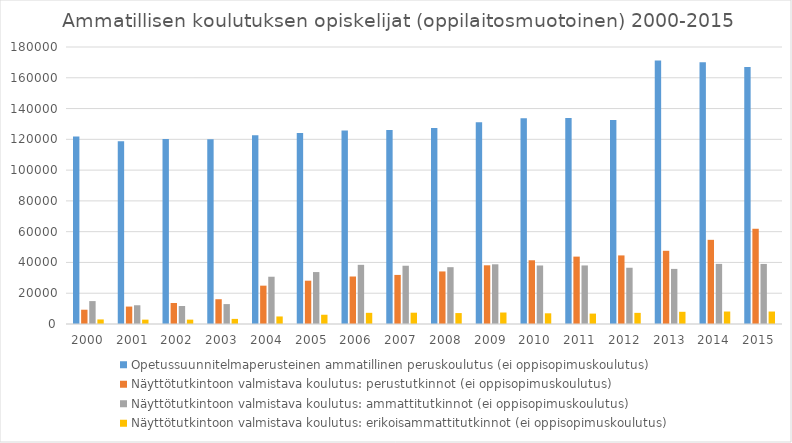
| Category | Opetussuunnitelmaperusteinen ammatillinen peruskoulutus (ei oppisopimuskoulutus) | Näyttötutkintoon valmistava koulutus: perustutkinnot (ei oppisopimuskoulutus) | Näyttötutkintoon valmistava koulutus: ammattitutkinnot (ei oppisopimuskoulutus) | Näyttötutkintoon valmistava koulutus: erikoisammattitutkinnot (ei oppisopimuskoulutus) |
|---|---|---|---|---|
| 2000 | 121812 | 9279 | 14888 | 2965 |
| 2001 | 118679 | 11325 | 12177 | 2838 |
| 2002 | 120217 | 13655 | 11687 | 2840 |
| 2003 | 120111 | 16098 | 12938 | 3313 |
| 2004 | 122607 | 24914 | 30716 | 4901 |
| 2005 | 124188 | 28140 | 33752 | 6011 |
| 2006 | 125674 | 30862 | 38445 | 7259 |
| 2007 | 126085 | 31890 | 37864 | 7345 |
| 2008 | 127284 | 34150 | 36922 | 7105 |
| 2009 | 131175 | 38148 | 38791 | 7461 |
| 2010 | 133770 | 41419 | 38021 | 6951 |
| 2011 | 133794 | 43790 | 38047 | 6759 |
| 2012 | 132554 | 44565 | 36558 | 7240 |
| 2013 | 171198 | 47572 | 35804 | 7932 |
| 2014 | 170026 | 54695 | 39051 | 8108 |
| 2015 | 166967 | 61887 | 39023 | 8106 |